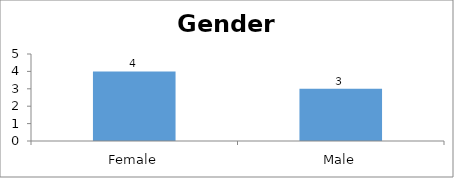
| Category | Gender |
|---|---|
| Female | 4 |
| Male | 3 |